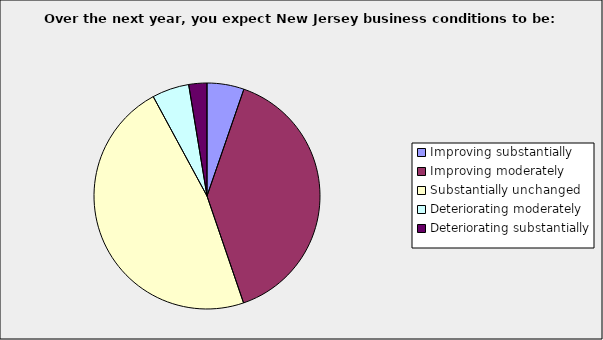
| Category | Series 0 |
|---|---|
| Improving substantially | 0.053 |
| Improving moderately | 0.395 |
| Substantially unchanged | 0.474 |
| Deteriorating moderately | 0.053 |
| Deteriorating substantially | 0.026 |